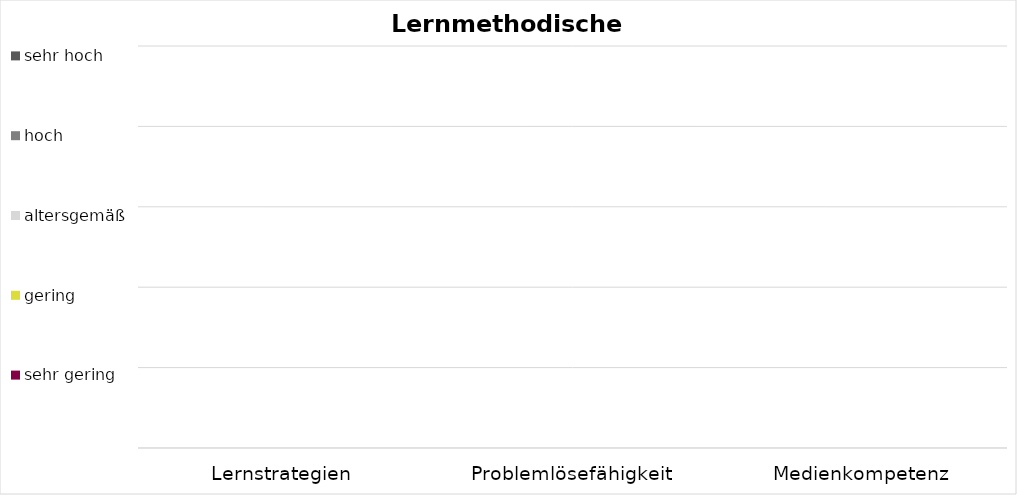
| Category | sehr gering | gering | altersgemäß | hoch | sehr hoch |
|---|---|---|---|---|---|
| Lernstrategien | 0 |  |  |  |  |
| Problemlösefähigkeit | 0 |  |  |  |  |
| Medienkompetenz | 0 |  |  |  |  |